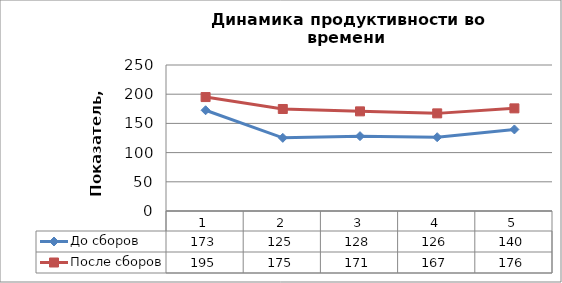
| Category | До сборов | После сборов |
|---|---|---|
| 0 | 172.506 | 195.072 |
| 1 | 125.264 | 174.68 |
| 2 | 128.162 | 170.609 |
| 3 | 126.356 | 167.169 |
| 4 | 139.661 | 175.734 |